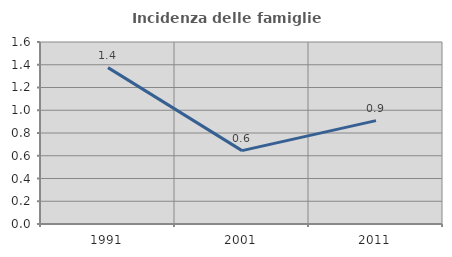
| Category | Incidenza delle famiglie numerose |
|---|---|
| 1991.0 | 1.375 |
| 2001.0 | 0.645 |
| 2011.0 | 0.909 |